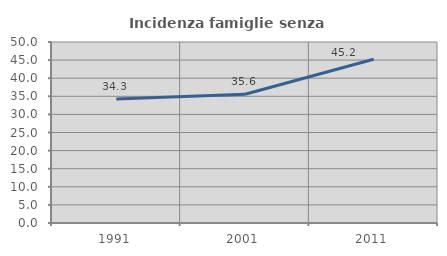
| Category | Incidenza famiglie senza nuclei |
|---|---|
| 1991.0 | 34.253 |
| 2001.0 | 35.584 |
| 2011.0 | 45.22 |